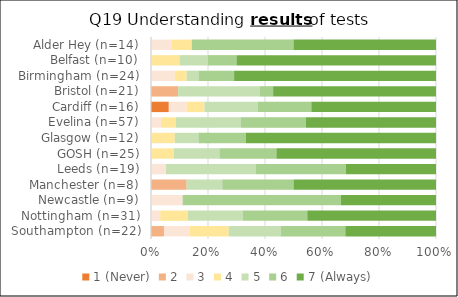
| Category | 1 (Never) | 2 | 3 | 4 | 5 | 6 | 7 (Always) |
|---|---|---|---|---|---|---|---|
| Southampton (n=22) | 0 | 1 | 2 | 3 | 4 | 5 | 7 |
| Nottingham (n=31) | 0 | 0 | 1 | 3 | 6 | 7 | 14 |
| Newcastle (n=9) | 0 | 0 | 1 | 0 | 0 | 5 | 3 |
| Manchester (n=8) | 0 | 1 | 0 | 0 | 1 | 2 | 4 |
| Leeds (n=19) | 0 | 0 | 1 | 0 | 6 | 6 | 6 |
| GOSH (n=25) | 0 | 0 | 0 | 2 | 4 | 5 | 14 |
| Glasgow (n=12) | 0 | 0 | 0 | 1 | 1 | 2 | 8 |
| Evelina (n=57) | 0 | 0 | 2 | 3 | 13 | 13 | 26 |
| Cardiff (n=16) | 1 | 0 | 1 | 1 | 3 | 3 | 7 |
| Bristol (n=21) | 0 | 2 | 0 | 0 | 6 | 1 | 12 |
| Birmingham (n=24) | 0 | 0 | 2 | 1 | 1 | 3 | 17 |
| Belfast (n=10) | 0 | 0 | 0 | 1 | 1 | 1 | 7 |
| Alder Hey (n=14) | 0 | 0 | 1 | 1 | 0 | 5 | 7 |